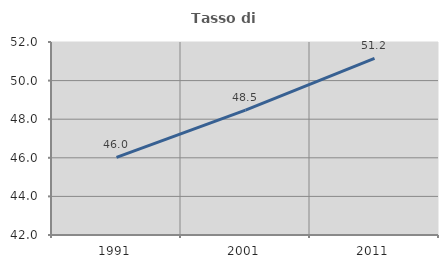
| Category | Tasso di occupazione   |
|---|---|
| 1991.0 | 46.018 |
| 2001.0 | 48.475 |
| 2011.0 | 51.152 |